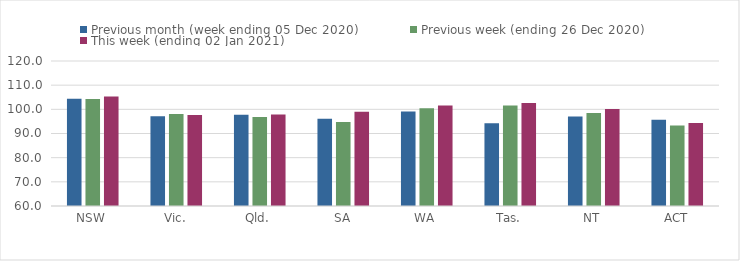
| Category | Previous month (week ending 05 Dec 2020) | Previous week (ending 26 Dec 2020) | This week (ending 02 Jan 2021) |
|---|---|---|---|
| NSW | 104.36 | 104.27 | 105.32 |
| Vic. | 97.12 | 98.08 | 97.68 |
| Qld. | 97.79 | 96.79 | 97.89 |
| SA | 96.09 | 94.76 | 99.02 |
| WA | 99.14 | 100.43 | 101.54 |
| Tas. | 94.28 | 101.56 | 102.63 |
| NT | 97.03 | 98.51 | 100.11 |
| ACT | 95.66 | 93.33 | 94.33 |